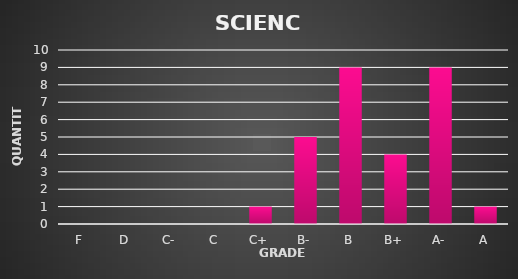
| Category | Series 0 |
|---|---|
| F | 0 |
| D | 0 |
| C- | 0 |
| C | 0 |
| C+ | 1 |
| B- | 5 |
| B | 9 |
| B+ | 4 |
| A- | 9 |
| A | 1 |